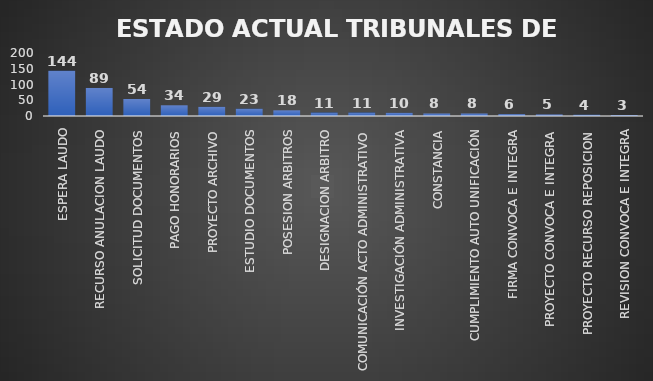
| Category | CANTIDAD | % |
|---|---|---|
| ESPERA LAUDO | 144 | 0.301 |
| RECURSO ANULACION LAUDO | 89 | 0.176 |
| SOLICITUD DOCUMENTOS | 54 | 0.116 |
| PAGO HONORARIOS | 34 | 0.068 |
| PROYECTO ARCHIVO | 29 | 0.061 |
| ESTUDIO DOCUMENTOS | 23 | 0.049 |
| POSESION ARBITROS | 18 | 0.036 |
| DESIGNACION ARBITRO | 11 | 0.031 |
| COMUNICACIÓN ACTO ADMINISTRATIVO | 11 | 0.028 |
| INVESTIGACIÓN ADMINISTRATIVA | 10 | 0.019 |
| CONSTANCIA | 8 | 0.019 |
| CUMPLIMIENTO AUTO UNIFICACIÓN | 8 | 0.017 |
| FIRMA CONVOCA E INTEGRA | 6 | 0.015 |
| PROYECTO CONVOCA E INTEGRA | 5 | 0.012 |
| PROYECTO RECURSO REPOSICION | 4 | 0.009 |
| REVISION CONVOCA E INTEGRA | 3 | 0.006 |